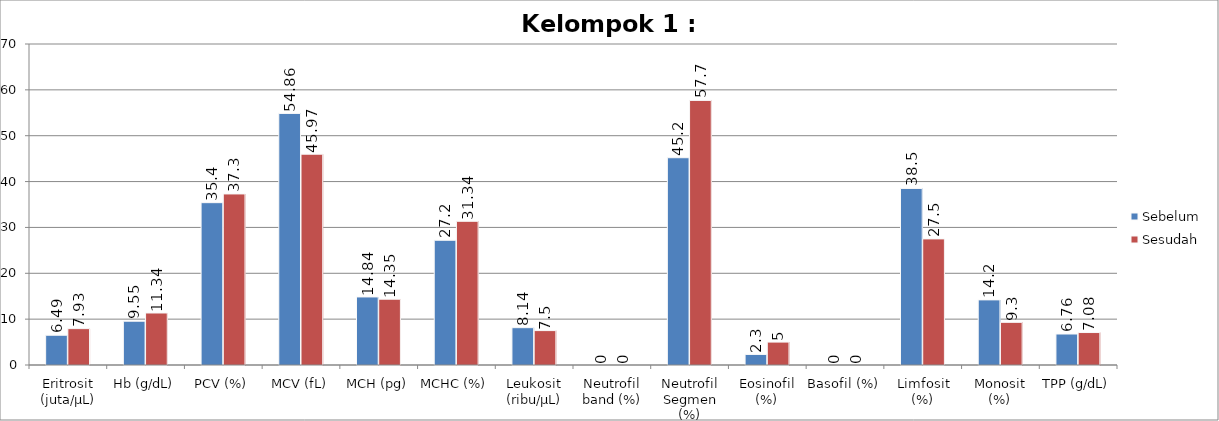
| Category | Sebelum | Sesudah |
|---|---|---|
| Eritrosit (juta/µL) | 6.49 | 7.93 |
| Hb (g/dL) | 9.55 | 11.34 |
| PCV (%) | 35.4 | 37.3 |
| MCV (fL) | 54.86 | 45.97 |
| MCH (pg) | 14.84 | 14.35 |
| MCHC (%) | 27.2 | 31.34 |
| Leukosit (ribu/µL) | 8.14 | 7.5 |
| Neutrofil band (%) | 0 | 0 |
| Neutrofil Segmen (%) | 45.2 | 57.7 |
| Eosinofil (%) | 2.3 | 5 |
| Basofil (%) | 0 | 0 |
| Limfosit (%) | 38.5 | 27.5 |
| Monosit (%) | 14.2 | 9.3 |
| TPP (g/dL) | 6.76 | 7.08 |